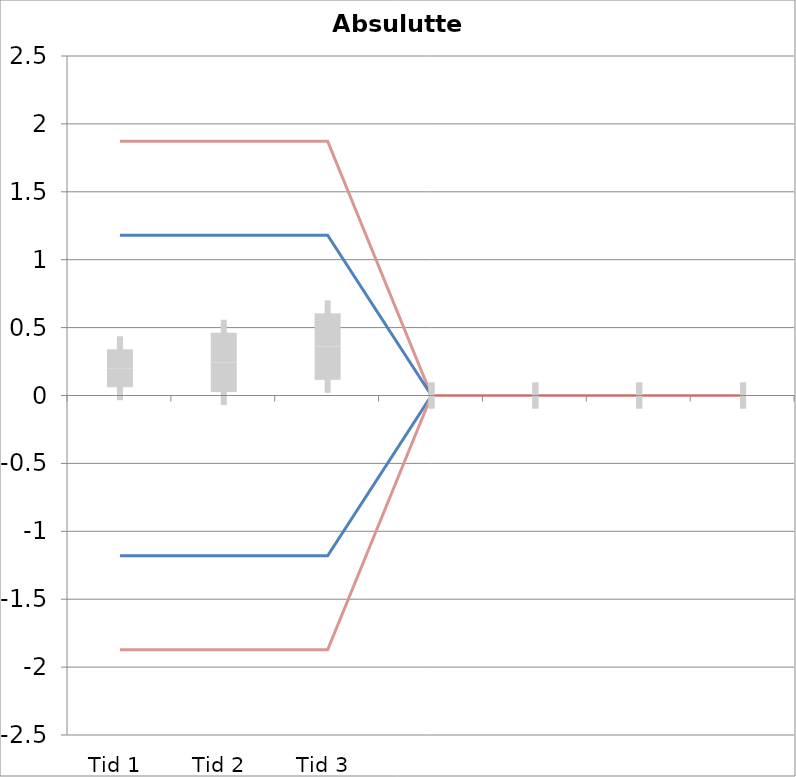
| Category | 1 | 2 | 3 | 4 | 5 | 6 | 7 | 8 | 9 | 10 | 11 | 12 | 13 | 14 | 15 | 16 | 17 | 18 | 19 | 20 | TEa | B | -B | -TEa | M |
|---|---|---|---|---|---|---|---|---|---|---|---|---|---|---|---|---|---|---|---|---|---|---|---|---|---|
| Tid 1 | -0.1 | 0.3 | 0.3 | 0.4 | 0.3 | -0.2 | 0.2 | 0.4 | 0 | -0.3 | 0.7 | 0.6 | 0.21 | 0.4 | 0.2 | 0 | 0 | 0 | 0 | 0 | 1.872 | 1.181 | -1.181 | -1.872 | 0.201 |
| Tid 2 | 0.1 | 0.3 | 0 | 1.1 | 0.3 | -0.3 | 0.2 | 0.4 | 0.1 | -0.3 | -0.5 | 0.5 | 0.3 | 0 | 0.8 | 0.6 | 0.3 | 0 | 0 | 0 | 1.872 | 1.181 | -1.181 | -1.872 | 0.244 |
| Tid 3 | 0 | 0.3 | 0 | 0.9 | 0.4 | -0.1 | 0.2 | 0.3 | -0.2 | -0.3 | 1.4 | 0.5 | 0 | 0.4 | 0.5 | 0.8 | 0.3 | 0 | 0 | 0 | 1.872 | 1.181 | -1.181 | -1.872 | 0.36 |